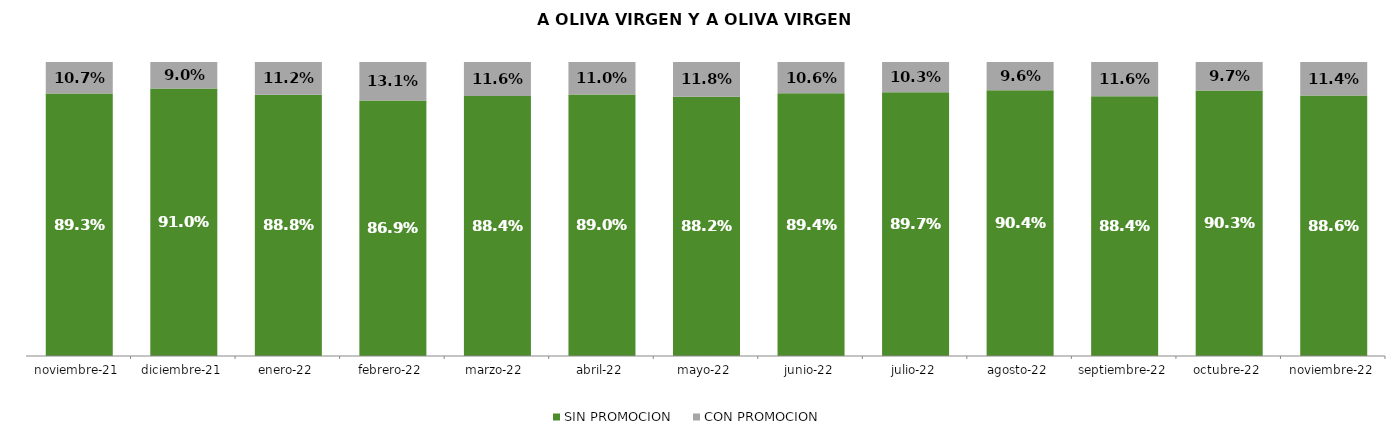
| Category | SIN PROMOCION   | CON PROMOCION   |
|---|---|---|
| 2021-11-01 | 0.893 | 0.107 |
| 2021-12-01 | 0.91 | 0.09 |
| 2022-01-01 | 0.888 | 0.112 |
| 2022-02-01 | 0.869 | 0.131 |
| 2022-03-01 | 0.884 | 0.116 |
| 2022-04-01 | 0.89 | 0.11 |
| 2022-05-01 | 0.882 | 0.118 |
| 2022-06-01 | 0.894 | 0.106 |
| 2022-07-01 | 0.897 | 0.103 |
| 2022-08-01 | 0.904 | 0.096 |
| 2022-09-01 | 0.884 | 0.116 |
| 2022-10-01 | 0.903 | 0.097 |
| 2022-11-01 | 0.886 | 0.114 |